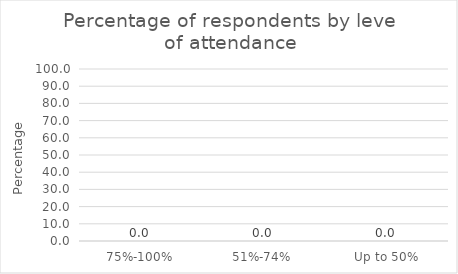
| Category | Series 0 |
|---|---|
| 75%-100% | 0 |
| 51%-74% | 0 |
| Up to 50% | 0 |